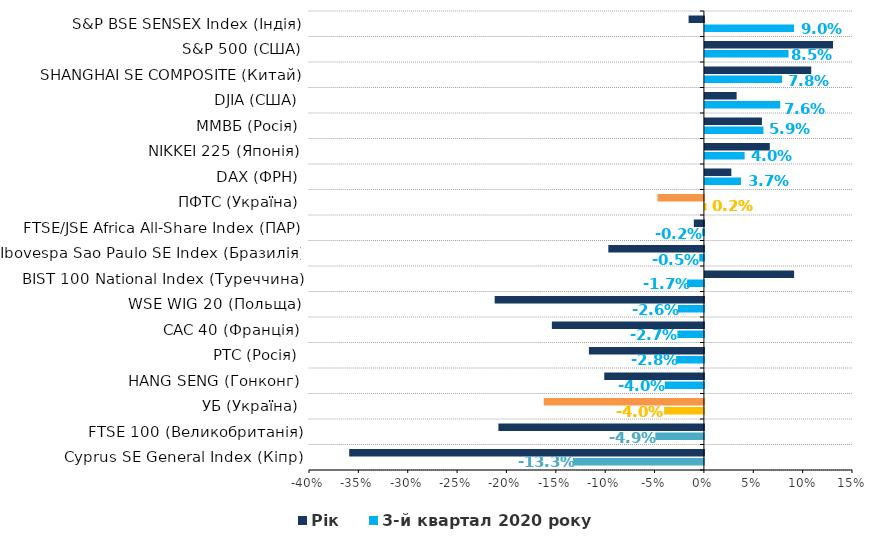
| Category | 3-й квартал 2020 року | Рік |
|---|---|---|
| Cyprus SE General Index (Кіпр) | -0.133 | -0.359 |
| FTSE 100 (Великобританія) | -0.049 | -0.208 |
| УБ (Україна) | -0.04 | -0.162 |
| HANG SENG (Гонконг) | -0.04 | -0.101 |
| РТС (Росія) | -0.028 | -0.116 |
| CAC 40 (Франція) | -0.027 | -0.154 |
| WSE WIG 20 (Польща) | -0.026 | -0.212 |
| BIST 100 National Index (Туреччина) | -0.017 | 0.09 |
| Ibovespa Sao Paulo SE Index (Бразилія) | -0.005 | -0.097 |
| FTSE/JSE Africa All-Share Index (ПАР) | -0.002 | -0.01 |
| ПФТС (Україна) | 0.002 | -0.047 |
| DAX (ФРН) | 0.037 | 0.027 |
| NIKKEI 225 (Японія) | 0.04 | 0.066 |
| ММВБ (Росія) | 0.059 | 0.058 |
| DJIA (США) | 0.076 | 0.032 |
| SHANGHAI SE COMPOSITE (Китай) | 0.078 | 0.108 |
| S&P 500 (США) | 0.085 | 0.13 |
| S&P BSE SENSEX Index (Індія) | 0.09 | -0.016 |